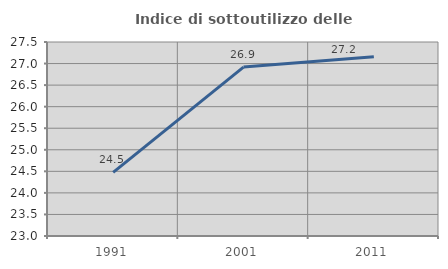
| Category | Indice di sottoutilizzo delle abitazioni  |
|---|---|
| 1991.0 | 24.474 |
| 2001.0 | 26.917 |
| 2011.0 | 27.158 |